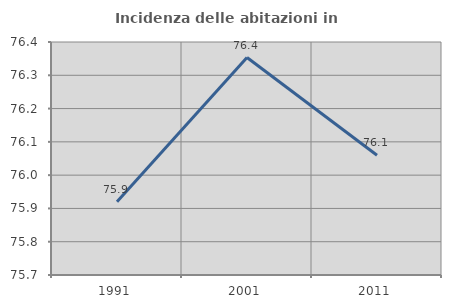
| Category | Incidenza delle abitazioni in proprietà  |
|---|---|
| 1991.0 | 75.92 |
| 2001.0 | 76.353 |
| 2011.0 | 76.06 |